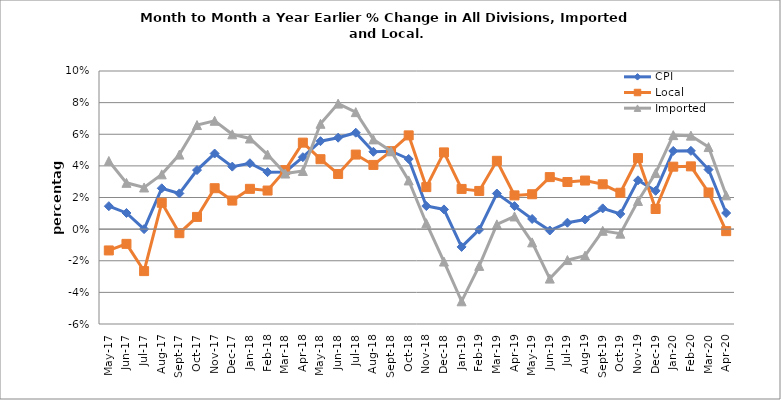
| Category | CPI | Local | Imported |
|---|---|---|---|
| 2017-05-01 | 0.015 | -0.013 | 0.043 |
| 2017-06-01 | 0.01 | -0.009 | 0.029 |
| 2017-07-01 | 0 | -0.027 | 0.026 |
| 2017-08-01 | 0.026 | 0.017 | 0.035 |
| 2017-09-01 | 0.023 | -0.003 | 0.047 |
| 2017-10-01 | 0.037 | 0.008 | 0.066 |
| 2017-11-01 | 0.048 | 0.026 | 0.069 |
| 2017-12-01 | 0.04 | 0.018 | 0.06 |
| 2018-01-01 | 0.042 | 0.025 | 0.057 |
| 2018-02-01 | 0.036 | 0.024 | 0.047 |
| 2018-03-01 | 0.036 | 0.037 | 0.035 |
| 2018-04-01 | 0.045 | 0.055 | 0.037 |
| 2018-05-01 | 0.056 | 0.044 | 0.067 |
| 2018-06-01 | 0.058 | 0.035 | 0.079 |
| 2018-07-01 | 0.061 | 0.047 | 0.074 |
| 2018-08-01 | 0.049 | 0.041 | 0.057 |
| 2018-09-01 | 0.049 | 0.049 | 0.049 |
| 2018-10-01 | 0.044 | 0.059 | 0.031 |
| 2018-11-01 | 0.015 | 0.027 | 0.004 |
| 2018-12-01 | 0.012 | 0.049 | -0.021 |
| 2019-01-01 | -0.011 | 0.025 | -0.046 |
| 2019-02-01 | 0 | 0.024 | -0.023 |
| 2019-03-01 | 0.023 | 0.043 | 0.003 |
| 2019-04-01 | 0.015 | 0.021 | 0.008 |
| 2019-05-01 | 0.006 | 0.022 | -0.008 |
| 2019-06-01 | -0.001 | 0.033 | -0.031 |
| 2019-07-01 | 0.004 | 0.03 | -0.02 |
| 2019-08-01 | 0.006 | 0.031 | -0.017 |
| 2019-09-01 | 0.013 | 0.028 | -0.001 |
| 2019-10-01 | 0.01 | 0.023 | -0.003 |
| 2019-11-01 | 0.031 | 0.045 | 0.018 |
| 2019-12-01 | 0.024 | 0.013 | 0.035 |
| 2020-01-01 | 0.049 | 0.039 | 0.059 |
| 2020-02-01 | 0.05 | 0.04 | 0.059 |
| 2020-03-01 | 0.038 | 0.023 | 0.052 |
| 2020-04-01 | 0.01 | -0.001 | 0.021 |